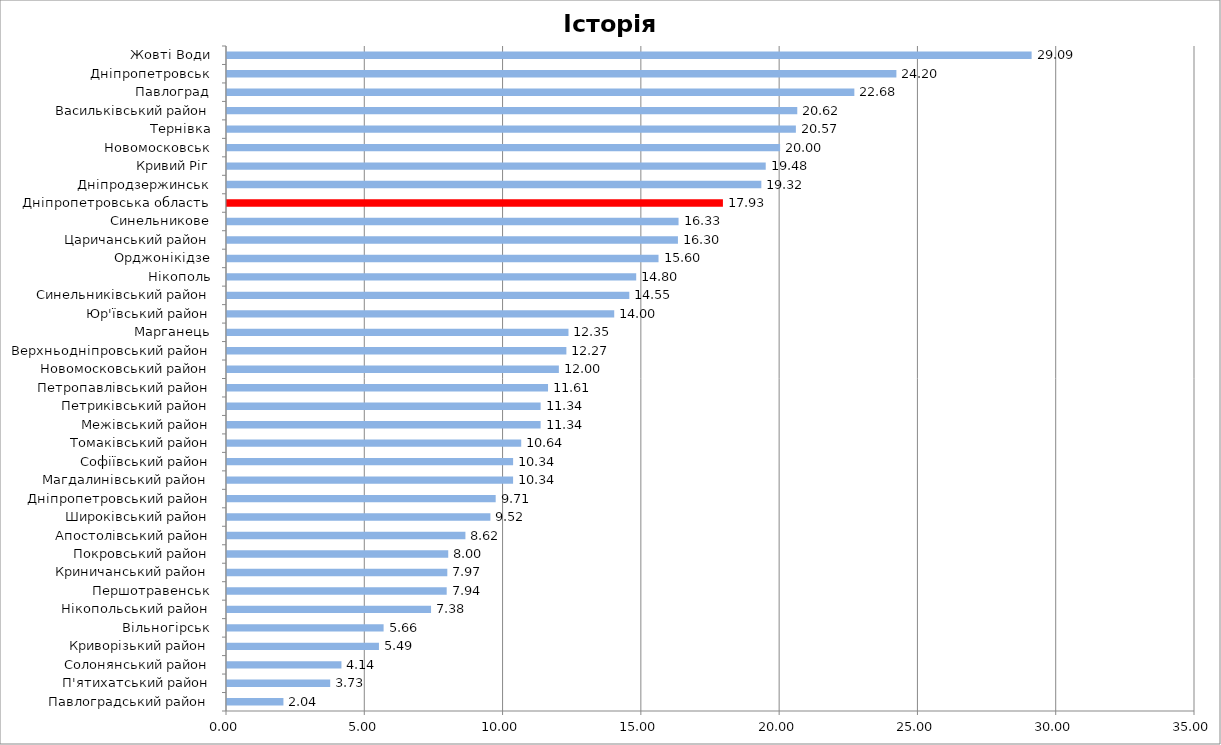
| Category | [160;200] |
|---|---|
| Павлоградський район | 2.04 |
| П'ятихатський район | 3.731 |
| Солонянський район | 4.138 |
| Криворізький район | 5.494 |
| Вільногірськ | 5.662 |
| Нікопольський район | 7.378 |
| Першотравенськ | 7.944 |
| Криничанський район | 7.966 |
| Покровський район | 7.999 |
| Апостолівський район | 8.62 |
| Широківський район | 9.524 |
| Дніпропетровський район | 9.715 |
| Магдалинівський район | 10.344 |
| Софіївський район | 10.345 |
| Томаківський район | 10.638 |
| Межівський район | 11.34 |
| Петриківський район | 11.34 |
| Петропавлівський район | 11.608 |
| Новомосковський район | 11.999 |
| Верхньодніпровський район | 12.271 |
| Марганець | 12.347 |
| Юр'ївський район | 14.001 |
| Синельниківський район | 14.547 |
| Нікополь | 14.796 |
| Орджонікідзе | 15.603 |
| Царичанський район | 16.305 |
| Синельникове | 16.327 |
| Дніпропетровська область | 17.931 |
| Дніпродзержинськ | 19.32 |
| Кривий Ріг | 19.479 |
| Новомосковськ | 19.998 |
| Тернівка | 20.569 |
| Васильківський район | 20.619 |
| Павлоград | 22.683 |
| Дніпропетровськ | 24.203 |
| Жовті Води | 29.093 |